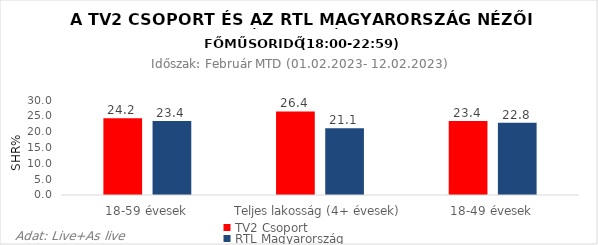
| Category | TV2 Csoport | RTL Magyarország |
|---|---|---|
| 18-59 évesek | 24.2 | 23.4 |
| Teljes lakosság (4+ évesek) | 26.4 | 21.1 |
| 18-49 évesek | 23.4 | 22.8 |